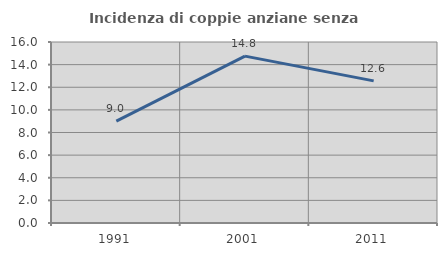
| Category | Incidenza di coppie anziane senza figli  |
|---|---|
| 1991.0 | 9.002 |
| 2001.0 | 14.75 |
| 2011.0 | 12.562 |